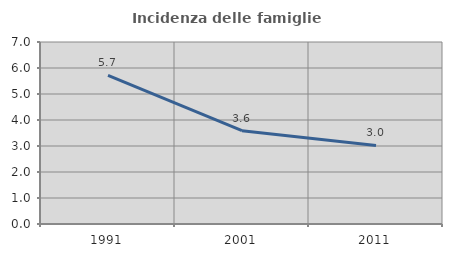
| Category | Incidenza delle famiglie numerose |
|---|---|
| 1991.0 | 5.714 |
| 2001.0 | 3.589 |
| 2011.0 | 3.023 |